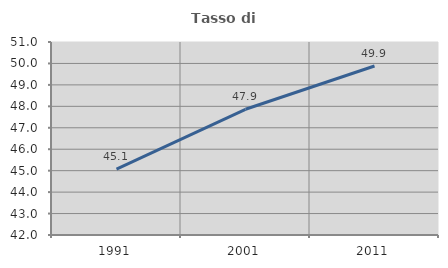
| Category | Tasso di occupazione   |
|---|---|
| 1991.0 | 45.073 |
| 2001.0 | 47.863 |
| 2011.0 | 49.88 |